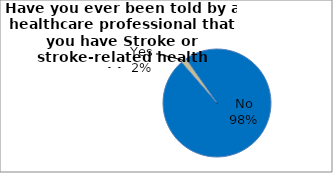
| Category | Series 0 |
|---|---|
| No | 98.337 |
| Yes | 1.663 |